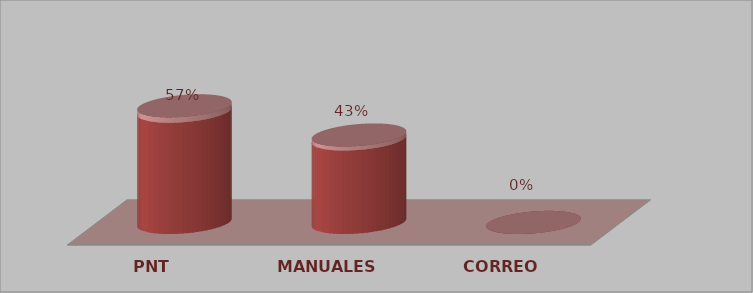
| Category | Series 0 | Series 1 |
|---|---|---|
| PNT | 12 | 0.571 |
| MANUALES | 9 | 0.429 |
| CORREO | 0 | 0 |